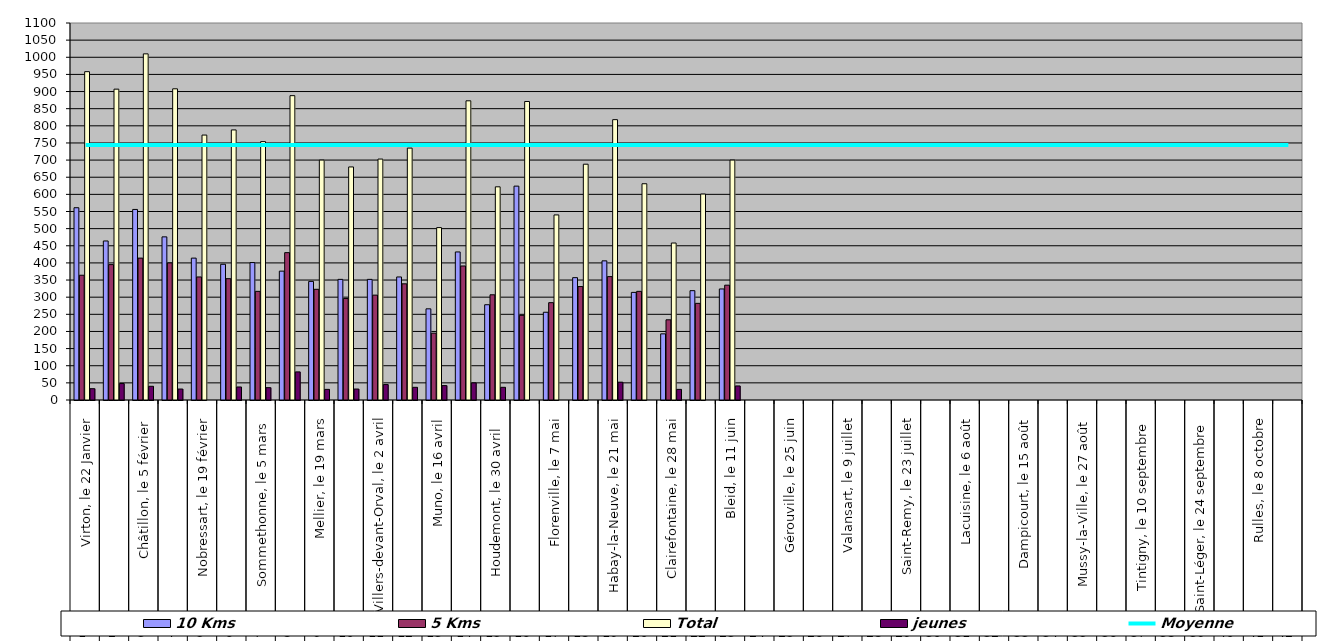
| Category | 10 Kms | 5 Kms | Total | jeunes |
|---|---|---|---|---|
| 0 | 561 | 364 | 958 | 33 |
| 1 | 464 | 395 | 907 | 48 |
| 2 | 556 | 414 | 1010 | 40 |
| 3 | 476 | 400 | 908 | 32 |
| 4 | 414 | 359 | 773 | 0 |
| 5 | 396 | 354 | 788 | 38 |
| 6 | 401 | 317 | 754 | 36 |
| 7 | 376 | 430 | 888 | 82 |
| 8 | 346 | 323 | 700 | 31 |
| 9 | 352 | 296 | 680 | 32 |
| 10 | 352 | 306 | 703 | 45 |
| 11 | 359 | 339 | 735 | 37 |
| 12 | 266 | 195 | 503 | 42 |
| 13 | 432 | 391 | 873 | 50 |
| 14 | 278 | 307 | 622 | 37 |
| 15 | 624 | 247 | 871 | 0 |
| 16 | 256 | 284 | 540 | 0 |
| 17 | 357 | 331 | 688 | 0 |
| 18 | 406 | 360 | 818 | 52 |
| 19 | 314 | 317 | 631 | 0 |
| 20 | 193 | 234 | 458 | 31 |
| 21 | 319 | 282 | 601 | 0 |
| 22 | 324 | 335 | 700 | 41 |
| 23 | 0 | 0 | 0 | 0 |
| 24 | 0 | 0 | 0 | 0 |
| 25 | 0 | 0 | 0 | 0 |
| 26 | 0 | 0 | 0 | 0 |
| 27 | 0 | 0 | 0 | 0 |
| 28 | 0 | 0 | 0 | 0 |
| 29 | 0 | 0 | 0 | 0 |
| 30 | 0 | 0 | 0 | 0 |
| 31 | 0 | 0 | 0 | 0 |
| 32 | 0 | 0 | 0 | 0 |
| 33 | 0 | 0 | 0 | 0 |
| 34 | 0 | 0 | 0 | 0 |
| 35 | 0 | 0 | 0 | 0 |
| 36 | 0 | 0 | 0 | 0 |
| 37 | 0 | 0 | 0 | 0 |
| 38 | 0 | 0 | 0 | 0 |
| 39 | 0 | 0 | 0 | 0 |
| 40 | 0 | 0 | 0 | 0 |
| 41 | 0 | 0 | 0 | 0 |